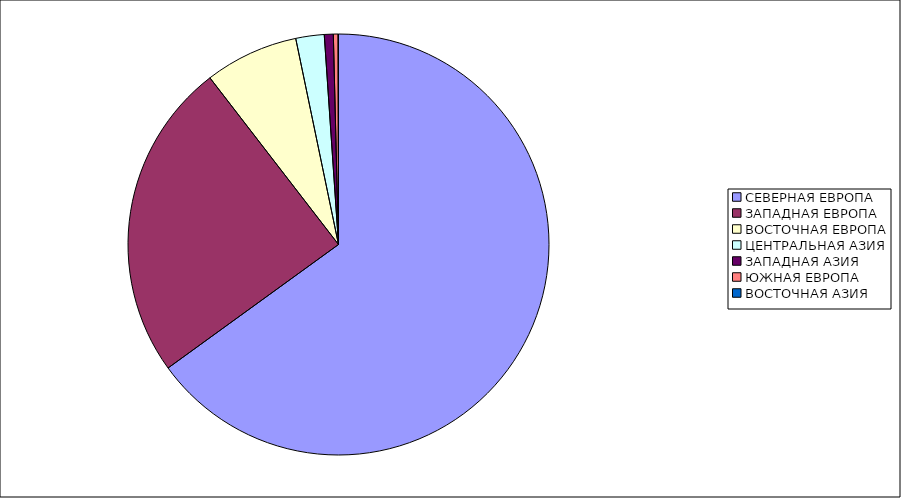
| Category | Оборот |
|---|---|
| СЕВЕРНАЯ ЕВРОПА | 65.02 |
| ЗАПАДНАЯ ЕВРОПА | 24.521 |
| ВОСТОЧНАЯ ЕВРОПА | 7.199 |
| ЦЕНТРАЛЬНАЯ АЗИЯ | 2.18 |
| ЗАПАДНАЯ АЗИЯ | 0.688 |
| ЮЖНАЯ ЕВРОПА | 0.361 |
| ВОСТОЧНАЯ АЗИЯ | 0.031 |